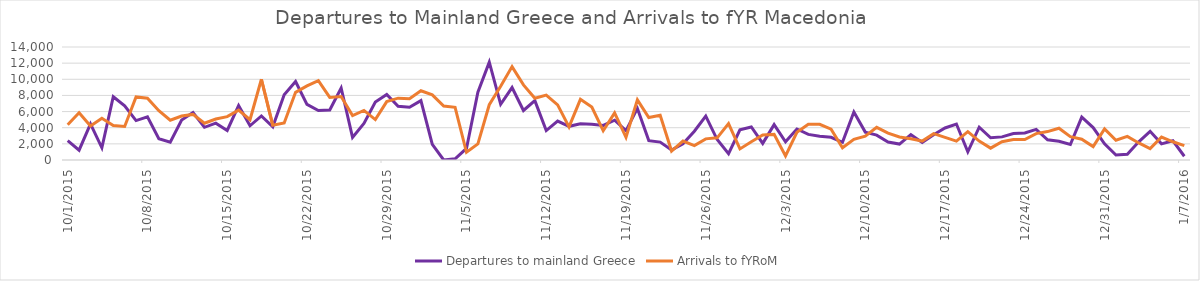
| Category | Departures to mainland Greece | Arrivals to fYRoM |
|---|---|---|
| 10/1/15 | 2409 | 4370 |
| 10/2/15 | 1215 | 5853 |
| 10/3/15 | 4480 | 4202 |
| 10/4/15 | 1513 | 5181 |
| 10/5/15 | 7833 | 4282 |
| 10/6/15 | 6707 | 4156 |
| 10/7/15 | 4886 | 7816 |
| 10/8/15 | 5349 | 7663 |
| 10/9/15 | 2631 | 6107 |
| 10/10/15 | 2214 | 4922 |
| 10/11/15 | 4950 | 5448 |
| 10/12/15 | 5879 | 5645 |
| 10/13/15 | 4052 | 4551 |
| 10/14/15 | 4564 | 5073 |
| 10/15/15 | 3660 | 5373 |
| 10/16/15 | 6743 | 6181 |
| 10/17/15 | 4239 | 4988 |
| 10/18/15 | 5457 | 10005 |
| 10/19/15 | 4119 | 4299 |
| 10/20/15 | 8083 | 4584 |
| 10/21/15 | 9725 | 8384 |
| 10/22/15 | 6896 | 9174 |
| 10/23/15 | 6120 | 9840 |
| 10/24/15 | 6195 | 7752 |
| 10/25/15 | 8916 | 7864 |
| 10/26/15 | 2804 | 5500 |
| 10/27/15 | 4540 | 6146 |
| 10/28/15 | 7191 | 5000 |
| 10/29/15 | 8117 | 7231 |
| 10/30/15 | 6649 | 7663 |
| 10/31/15 | 6537 | 7590 |
| 11/1/15 | 7360 | 8584 |
| 11/2/15 | 1935 | 8075 |
| 11/3/15 | 0 | 6682 |
| 11/4/15 | 142 | 6532 |
| 11/5/15 | 1430 | 960 |
| 11/6/15 | 8392 | 1987 |
| 11/7/15 | 12116 | 6847 |
| 11/8/15 | 6902 | 9148 |
| 11/9/15 | 8977 | 11572 |
| 11/10/15 | 6133 | 9305 |
| 11/11/15 | 7354 | 7651 |
| 11/12/15 | 3650 | 8038 |
| 11/13/15 | 4820 | 6826 |
| 11/14/15 | 4171 | 4107 |
| 11/15/15 | 4497 | 7511 |
| 11/16/15 | 4442 | 6557 |
| 11/17/15 | 4289 | 3621 |
| 11/18/15 | 4927 | 5831 |
| 11/19/15 | 3644 | 2816 |
| 11/20/15 | 6389 | 7453 |
| 11/21/15 | 2401 | 5255 |
| 11/22/15 | 2214 | 5539 |
| 11/23/15 | 1245 | 1113 |
| 11/24/15 | 2006 | 2347 |
| 11/25/15 | 3565 | 1779 |
| 11/26/15 | 5435 | 2617 |
| 11/27/15 | 2532 | 2744 |
| 11/28/15 | 778 | 4520 |
| 11/29/15 | 3736 | 1373 |
| 11/30/15 | 4090 | 2270 |
| 12/1/15 | 2057 | 3094 |
| 12/2/15 | 4384 | 3174 |
| 12/3/15 | 2255 | 494 |
| 12/4/15 | 3844 | 3436 |
| 12/5/15 | 3172 | 4430 |
| 12/6/15 | 2943 | 4425 |
| 12/7/15 | 2810 | 3826 |
| 12/8/15 | 2189 | 1508 |
| 12/9/15 | 5947 | 2550 |
| 12/10/15 | 3456 | 2956 |
| 12/11/15 | 3079 | 4047 |
| 12/12/15 | 2235 | 3338 |
| 12/13/15 | 1976 | 2849 |
| 12/14/15 | 3138 | 2644 |
| 12/15/15 | 2173 | 2349 |
| 12/16/15 | 3137 | 3264 |
| 12/17/15 | 3967 | 2801 |
| 12/18/15 | 4458 | 2332 |
| 12/19/15 | 1016 | 3515 |
| 12/20/15 | 4070 | 2338 |
| 12/21/15 | 2757 | 1470 |
| 12/22/15 | 2864 | 2272 |
| 12/23/15 | 3278 | 2529 |
| 12/24/15 | 3349 | 2529 |
| 12/25/15 | 3801 | 3268 |
| 12/26/15 | 2498 | 3521 |
| 12/27/15 | 2311 | 3938 |
| 12/28/15 | 1924 | 2884 |
| 12/29/15 | 5309 | 2577 |
| 12/30/15 | 4021 | 1665 |
| 12/31/15 | 2009 | 3848 |
| 1/1/16 | 623 | 2454 |
| 1/2/16 | 720 | 2918 |
| 1/3/16 | 2249 | 2112 |
| 1/4/16 | 3549 | 1415 |
| 1/5/16 | 1998 | 2842 |
| 1/6/16 | 2377 | 2258 |
| 1/7/16 | 463 | 1776 |